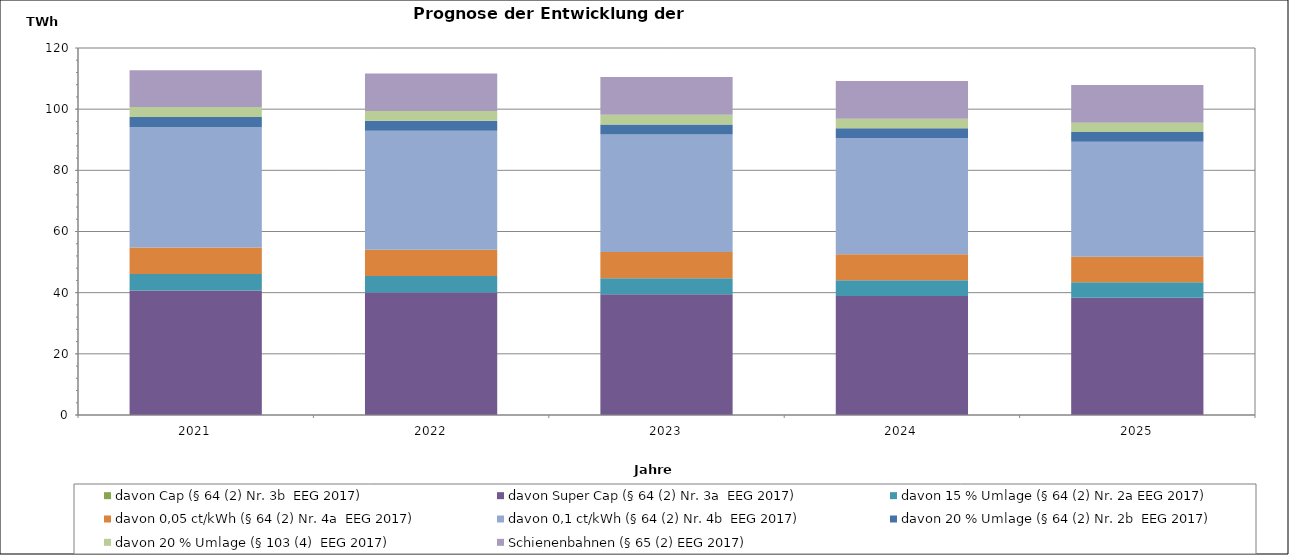
| Category | davon Cap (§ 64 (2) Nr. 3b  EEG 2017) | davon Super Cap (§ 64 (2) Nr. 3a  EEG 2017) | davon 15 % Umlage (§ 64 (2) Nr. 2a EEG 2017) | davon 0,05 ct/kWh (§ 64 (2) Nr. 4a  EEG 2017) | davon 0,1 ct/kWh (§ 64 (2) Nr. 4b  EEG 2017) | davon 20 % Umlage (§ 64 (2) Nr. 2b  EEG 2017) | davon 20 % Umlage (§ 103 (4)  EEG 2017) | Schienenbahnen (§ 65 (2) EEG 2017) |
|---|---|---|---|---|---|---|---|---|
| 2021.0 | 0 | 40.673 | 5.394 | 8.736 | 39.293 | 3.333 | 3.266 | 12.038 |
| 2022.0 | 0 | 40.092 | 5.318 | 8.643 | 38.878 | 3.286 | 3.214 | 12.222 |
| 2023.0 | 0 | 39.505 | 5.24 | 8.548 | 38.448 | 3.239 | 3.162 | 12.34 |
| 2024.0 | 0 | 38.918 | 5.16 | 8.451 | 38.011 | 3.191 | 3.112 | 12.351 |
| 2025.0 | 0 | 38.34 | 5.082 | 8.354 | 37.577 | 3.144 | 3.063 | 12.358 |